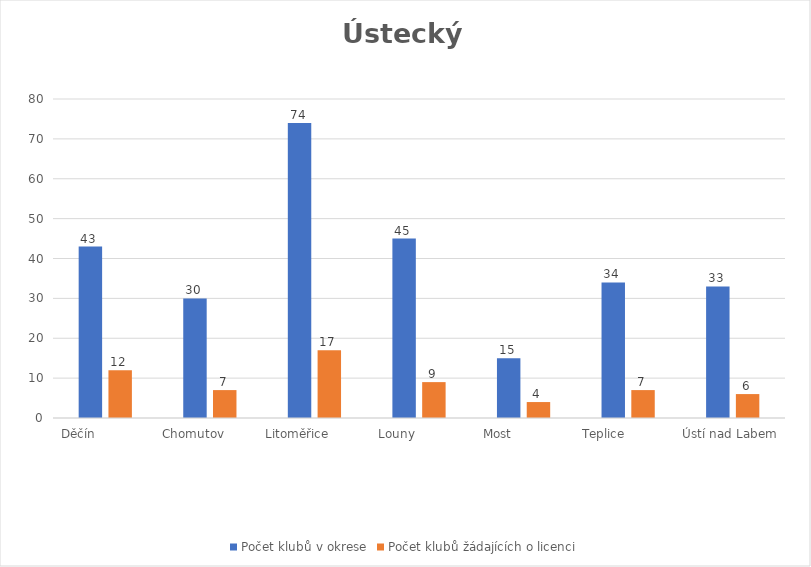
| Category | Počet klubů v okrese | Počet klubů žádajících o licenci |
|---|---|---|
| Děčín              | 43 | 12 |
| Chomutov         | 30 | 7 |
| Litoměřice         | 74 | 17 |
| Louny            | 45 | 9 |
| Most              | 15 | 4 |
| Teplice             | 34 | 7 |
| Ústí nad Labem   | 33 | 6 |